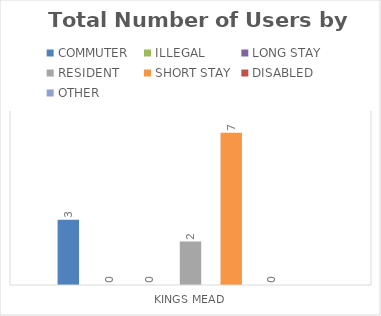
| Category | COMMUTER | ILLEGAL | LONG STAY | RESIDENT | SHORT STAY | DISABLED | OTHER |
|---|---|---|---|---|---|---|---|
| KINGS MEAD | 3 | 0 | 0 | 2 | 7 | 0 | 0 |